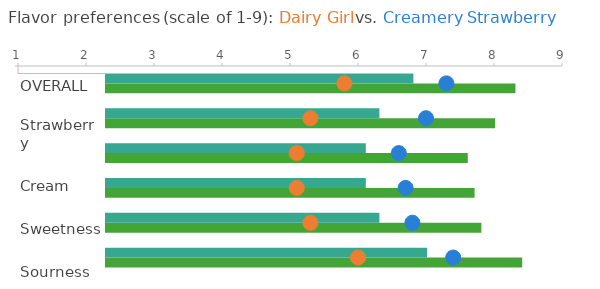
| Category | BACK (C) | FRONT (DG) |
|---|---|---|
| 7.3 | 7.4 | 6 |
| 7.0 | 6.8 | 5.3 |
| 6.6 | 6.7 | 5.1 |
| 6.7 | 6.6 | 5.1 |
| 6.8 | 7 | 5.3 |
| 7.4 | 7.3 | 5.8 |